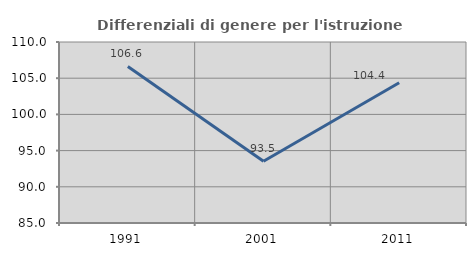
| Category | Differenziali di genere per l'istruzione superiore |
|---|---|
| 1991.0 | 106.627 |
| 2001.0 | 93.524 |
| 2011.0 | 104.362 |